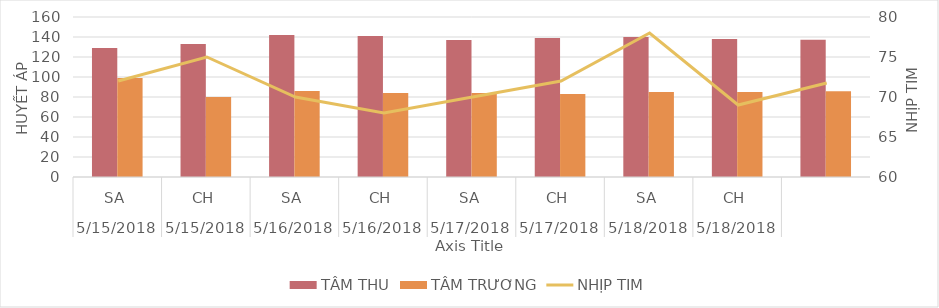
| Category | TÂM THU | TÂM TRƯƠNG |
|---|---|---|
| 0 | 129 | 99 |
| 1/1/00 | 133 | 80 |
| 1/2/00 | 142 | 86 |
| 1/3/00 | 141 | 84 |
| 1/4/00 | 137 | 84 |
| 1/5/00 | 139 | 83 |
| 1/6/00 | 140 | 85 |
| 1/7/00 | 138 | 85 |